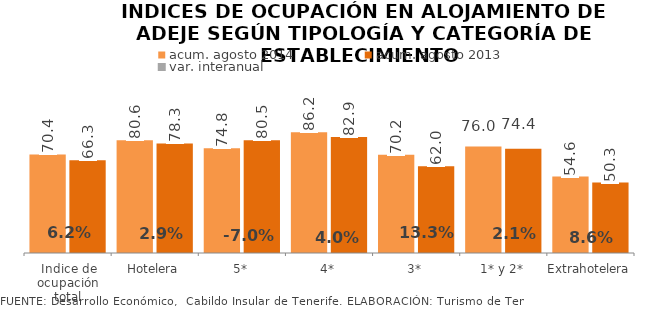
| Category | acum. agosto 2014 | acum. agosto 2013 |
|---|---|---|
| Indice de ocupación total | 70.414 | 66.311 |
| Hotelera | 80.556 | 78.301 |
| 5* | 74.846 | 80.472 |
| 4* | 86.22 | 82.909 |
| 3* | 70.219 | 61.957 |
| 1* y 2* | 76.015 | 74.442 |
| Extrahotelera | 54.583 | 50.278 |